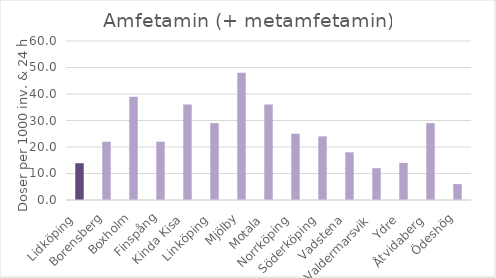
| Category | Amfetamin (+ metamfetamin) |
|---|---|
| Lidköping  | 13.886 |
| Borensberg | 22 |
| Boxholm | 39 |
| Finspång | 22 |
| Kinda Kisa  | 36 |
| Linköping  | 29 |
| Mjölby | 48 |
| Motala  | 36 |
| Norrköping  | 25 |
| Söderköping  | 24 |
| Vadstena  | 18 |
| Valdermarsvik  | 12 |
| Ydre  | 14 |
| Åtvidaberg  | 29 |
| Ödeshög | 6 |